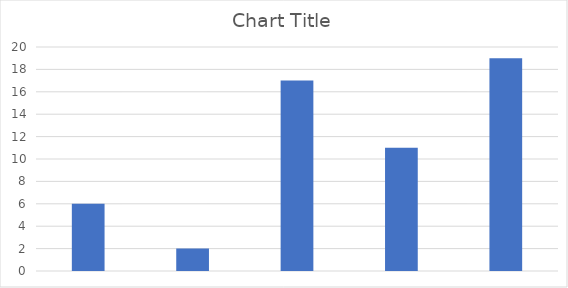
| Category | Chart Title |
|---|---|
| East | 6 |
| West | 2 |
| South | 17 |
| North | 11 |
| Central | 19 |